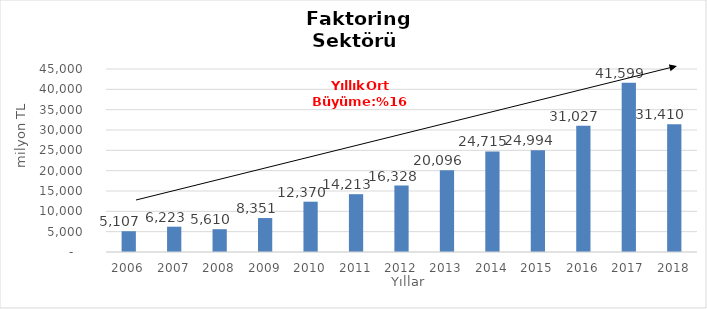
| Category | Faktoring  |
|---|---|
| 2006.0 | 5107.149 |
| 2007.0 | 6222.508 |
| 2008.0 | 5610.293 |
| 2009.0 | 8350.82 |
| 2010.0 | 12369.836 |
| 2011.0 | 14213.285 |
| 2012.0 | 16327.829 |
| 2013.0 | 20095.909 |
| 2014.0 | 24715 |
| 2015.0 | 24994 |
| 2016.0 | 31027 |
| 2017.0 | 41599 |
| 2018.0 | 31410 |